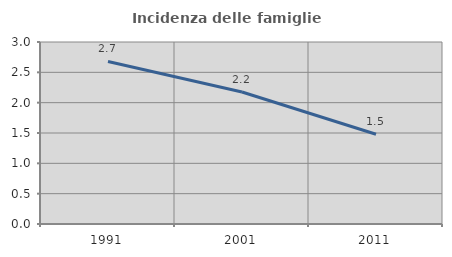
| Category | Incidenza delle famiglie numerose |
|---|---|
| 1991.0 | 2.679 |
| 2001.0 | 2.176 |
| 2011.0 | 1.48 |